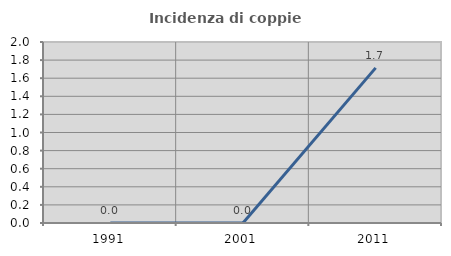
| Category | Incidenza di coppie miste |
|---|---|
| 1991.0 | 0 |
| 2001.0 | 0 |
| 2011.0 | 1.714 |